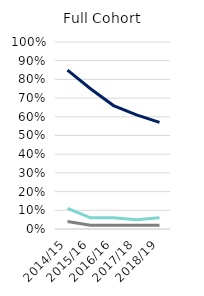
| Category | Employed | Self-Employed | Both |
|---|---|---|---|
| 2014/15 | 0.85 | 0.11 | 0.04 |
| 2015/16 | 0.75 | 0.06 | 0.02 |
| 2016/16 | 0.66 | 0.06 | 0.02 |
| 2017/18 | 0.61 | 0.05 | 0.02 |
| 2018/19 | 0.57 | 0.06 | 0.02 |